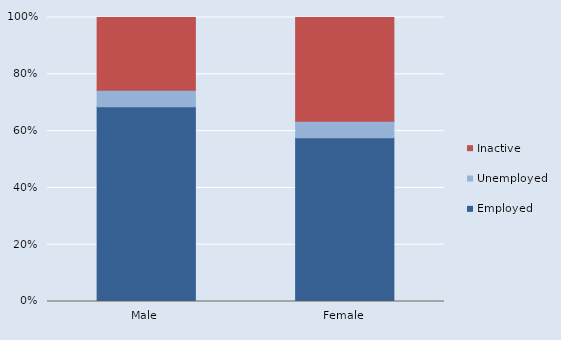
| Category | Employed  | Unemployed  | Inactive  |
|---|---|---|---|
| Male | 504543 | 42729 | 188746 |
| Female | 401042 | 40116 | 254172 |